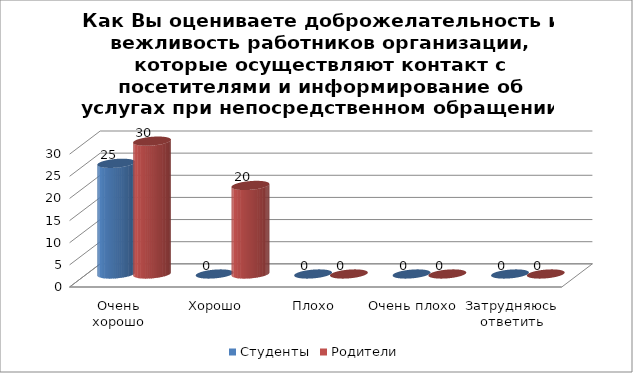
| Category | Студенты | Родители |
|---|---|---|
| Очень хорошо | 25 | 30 |
| Хорошо | 0 | 20 |
| Плохо | 0 | 0 |
| Очень плохо | 0 | 0 |
| Затрудняюсь ответить | 0 | 0 |